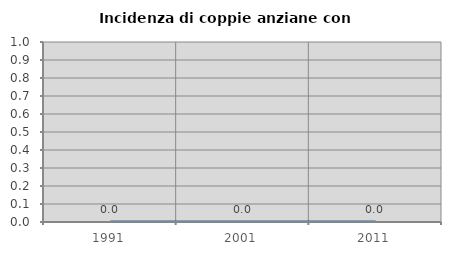
| Category | Incidenza di coppie anziane con figli |
|---|---|
| 1991.0 | 0 |
| 2001.0 | 0 |
| 2011.0 | 0 |